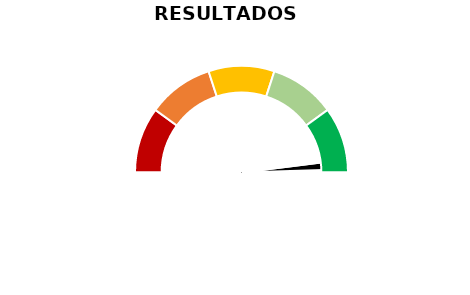
| Category | Puntero |
|---|---|
| 0 | 96 |
| 1 | 3 |
| 2 | 101 |